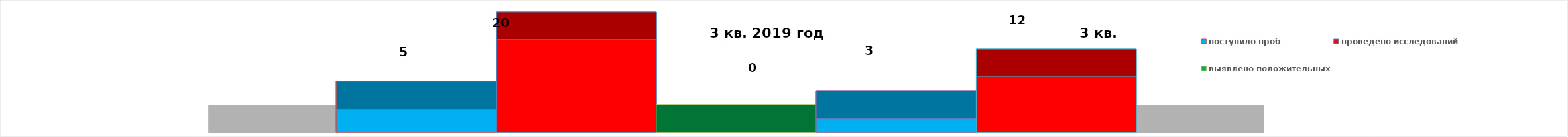
| Category | поступило проб | проведено исследований | выявлено положительных | 3 квартал 2020 год | 2016 год |
|---|---|---|---|---|---|
| 0 | 5 | 20 | 0 | 3 | 12 |